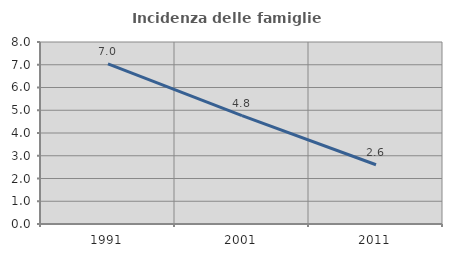
| Category | Incidenza delle famiglie numerose |
|---|---|
| 1991.0 | 7.042 |
| 2001.0 | 4.762 |
| 2011.0 | 2.605 |